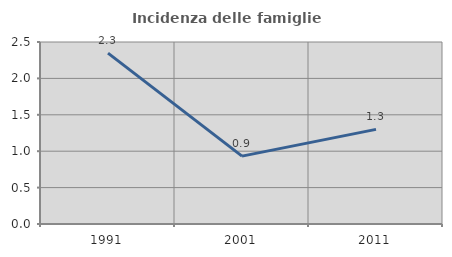
| Category | Incidenza delle famiglie numerose |
|---|---|
| 1991.0 | 2.347 |
| 2001.0 | 0.933 |
| 2011.0 | 1.299 |